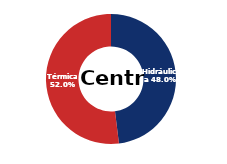
| Category | Centro |
|---|---|
| Eólica | 0 |
| Hidráulica | 1911.494 |
| Solar | 0.006 |
| Térmica | 2066.847 |